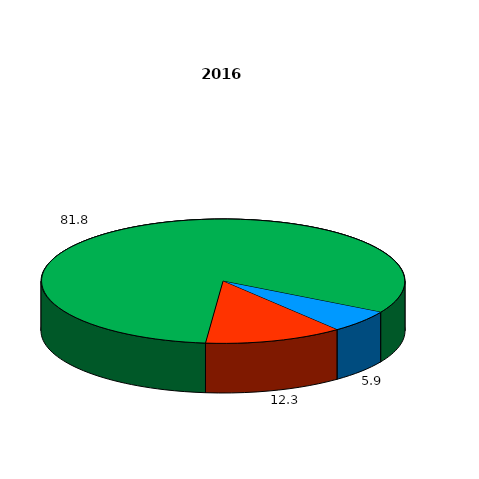
| Category | Series 0 |
|---|---|
| Сельскохозяйственные организации  | 5.9 |
| Крестьянские (фермерские) хозяйства и индивидуальные предприниматели  | 12.3 |
| Личные подсобные и другие индивидуальные хозяйства граждан  | 81.8 |